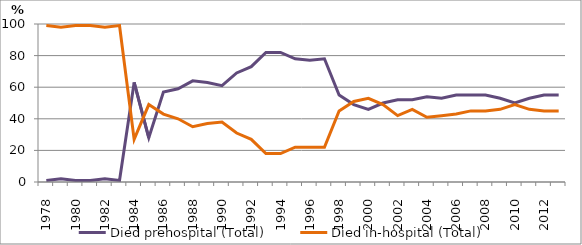
| Category | Died prehospital (Total) | Died in-hospital (Total) |
|---|---|---|
| 1978.0 | 1 | 99 |
| 1979.0 | 2 | 98 |
| 1980.0 | 1 | 99 |
| 1981.0 | 1 | 99 |
| 1982.0 | 2 | 98 |
| 1983.0 | 1 | 99 |
| 1984.0 | 63 | 27 |
| 1985.0 | 28 | 49 |
| 1986.0 | 57 | 43 |
| 1987.0 | 59 | 40 |
| 1988.0 | 64 | 35 |
| 1989.0 | 63 | 37 |
| 1990.0 | 61 | 38 |
| 1991.0 | 69 | 31 |
| 1992.0 | 73 | 27 |
| 1993.0 | 82 | 18 |
| 1994.0 | 82 | 18 |
| 1995.0 | 78 | 22 |
| 1996.0 | 77 | 22 |
| 1997.0 | 78 | 22 |
| 1998.0 | 55 | 45 |
| 1999.0 | 49 | 51 |
| 2000.0 | 46 | 53 |
| 2001.0 | 50 | 49 |
| 2002.0 | 52 | 42 |
| 2003.0 | 52 | 46 |
| 2004.0 | 54 | 41 |
| 2005.0 | 53 | 42 |
| 2006.0 | 55 | 43 |
| 2007.0 | 55 | 45 |
| 2008.0 | 55 | 45 |
| 2009.0 | 53 | 46 |
| 2010.0 | 50 | 49 |
| 2011.0 | 53 | 46 |
| 2012.0 | 55 | 45 |
| 2013.0 | 55 | 45 |